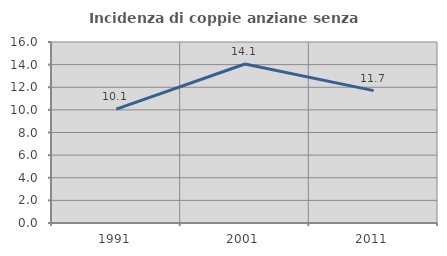
| Category | Incidenza di coppie anziane senza figli  |
|---|---|
| 1991.0 | 10.063 |
| 2001.0 | 14.056 |
| 2011.0 | 11.704 |